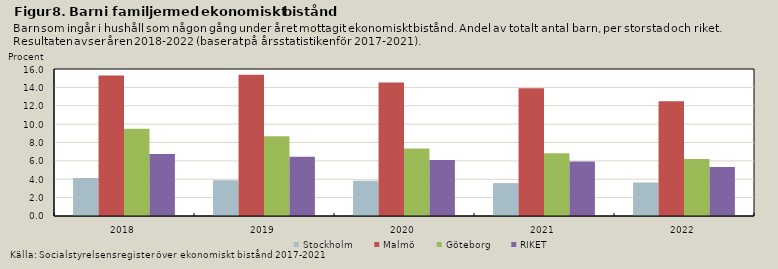
| Category | Stockholm | Malmö | Göteborg | RIKET |
|---|---|---|---|---|
| 2018.0 | 4.133 | 15.286 | 9.49 | 6.758 |
| 2019.0 | 3.893 | 15.382 | 8.689 | 6.439 |
| 2020.0 | 3.843 | 14.523 | 7.348 | 6.092 |
| 2021.0 | 3.579 | 13.892 | 6.827 | 5.941 |
| 2022.0 | 3.645 | 12.5 | 6.202 | 5.334 |